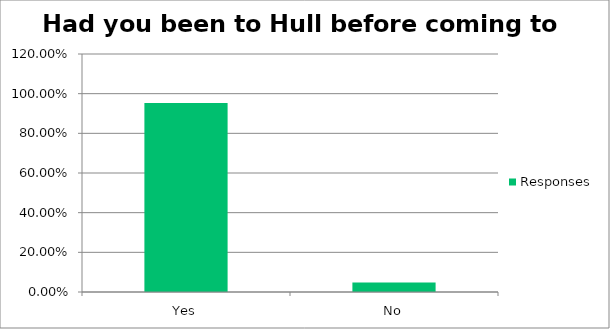
| Category | Responses |
|---|---|
| Yes | 0.952 |
| No | 0.048 |